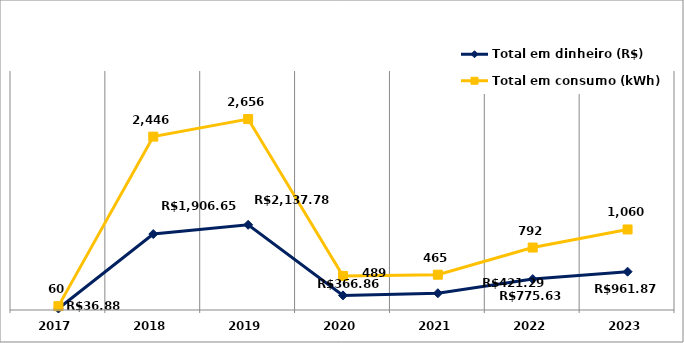
| Category | Total em dinheiro (R$) | Total em consumo (kWh) |
|---|---|---|
| 2017.0 | 36.88 | 60 |
| 2018.0 | 1906.65 | 2446 |
| 2019.0 | 2137.78 | 2656 |
| 2020.0 | 366.86 | 489 |
| 2021.0 | 421.29 | 465 |
| 2022.0 | 775.63 | 792 |
| 2023.0 | 961.87 | 1060 |